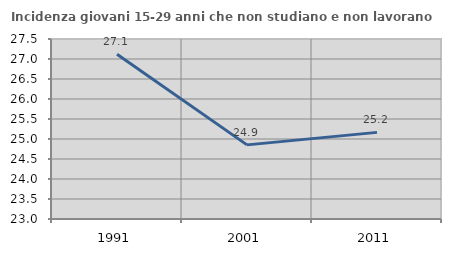
| Category | Incidenza giovani 15-29 anni che non studiano e non lavorano  |
|---|---|
| 1991.0 | 27.119 |
| 2001.0 | 24.853 |
| 2011.0 | 25.166 |